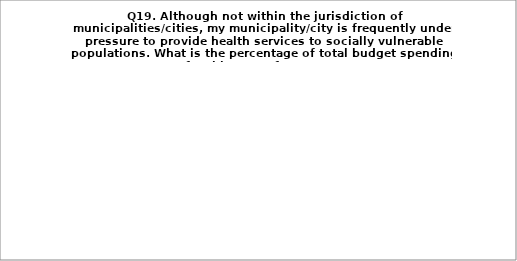
| Category | Series 0 |
|---|---|
| 2% | 44.828 |
| 3% | 13.793 |
| 5% | 12.069 |
| 7% and more  | 6.897 |
| My municipality/city has no such expenditures | 22.414 |